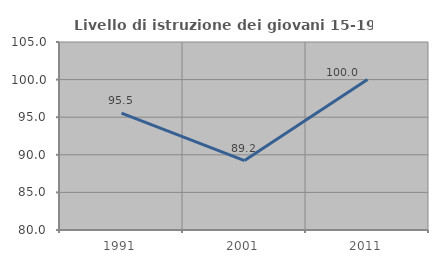
| Category | Livello di istruzione dei giovani 15-19 anni |
|---|---|
| 1991.0 | 95.536 |
| 2001.0 | 89.231 |
| 2011.0 | 100 |